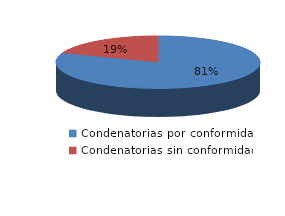
| Category | Series 0 |
|---|---|
| 0 | 185 |
| 1 | 44 |